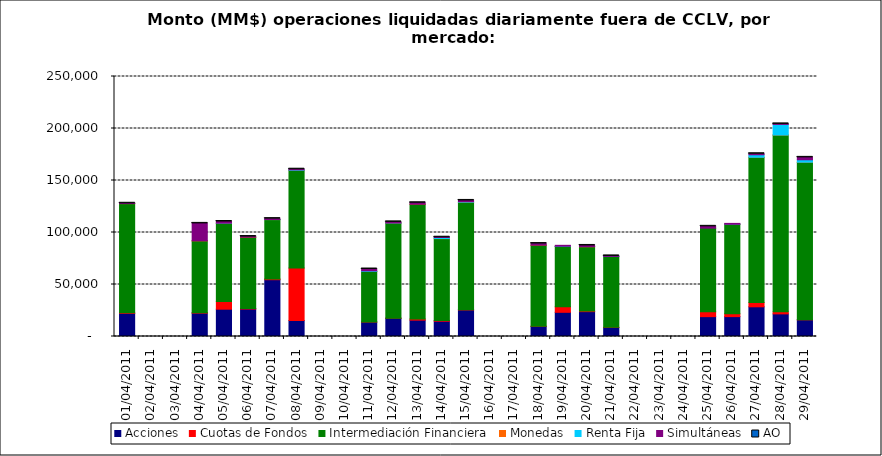
| Category | Acciones | Cuotas de Fondos | Intermediación Financiera | Monedas | Renta Fija | Simultáneas | AO |
|---|---|---|---|---|---|---|---|
| 01/04/2011 | 22264.197 | 586.156 | 104943.532 | 11.323 | 0 | 280.113 | 0.013 |
| 04/04/2011 | 22448.021 | 443.209 | 69111.594 | 4.522 | 0 | 16739.111 | 0.68 |
| 05/04/2011 | 26262.252 | 7355.951 | 75334.115 | 17.674 | 31.935 | 1554.46 | 0.091 |
| 06/04/2011 | 26410.345 | 490.628 | 68619.976 | 0.9 | 0 | 573.157 | 0.369 |
| 07/04/2011 | 54597.099 | 742.13 | 57081.821 | 4.95 | 44.31 | 854.378 | 0.042 |
| 08/04/2011 | 15390.42 | 50570.115 | 93793.987 | 16.65 | 495.311 | 567.007 | 0.17 |
| 11/04/2011 | 13861.851 | 194.394 | 48473.616 | 0.45 | 598.526 | 1733.566 | 0.634 |
| 12/04/2011 | 17545.525 | 54.77 | 91561.272 | 5.167 | 22.203 | 1009.548 | 0.492 |
| 13/04/2011 | 15722.303 | 1177.219 | 110260.082 | 5.84 | 0 | 1409.89 | 0.01 |
| 14/04/2011 | 14688.852 | 789.483 | 78618.838 | 102.15 | 1016.715 | 229.176 | 0.103 |
| 15/04/2011 | 25505.648 | 224.17 | 103432.611 | 12.012 | 506.319 | 1147.445 | 0.118 |
| 18/04/2011 | 9695.876 | 167.431 | 77981.93 | 5.436 | 0 | 1489.901 | 0.041 |
| 19/04/2011 | 23255.628 | 5315.809 | 58014.318 | 9.033 | 214.246 | 855.503 | 0 |
| 20/04/2011 | 23905.889 | 522.252 | 61909.866 | 2.718 | 0 | 1191.568 | 0.087 |
| 21/04/2011 | 8654.172 | 174.666 | 68104.956 | 0 | 68.351 | 471.978 | 0.008 |
| 25/04/2011 | 19090.658 | 4777.368 | 80307.008 | 0 | 0 | 1739.644 | 0.77 |
| 26/04/2011 | 19120.847 | 2721.053 | 86039.882 | 18.19 | 5.661 | 849.167 | 0 |
| 27/04/2011 | 28548.983 | 4044.922 | 139740.569 | 2.35 | 2412.235 | 951.229 | 1.229 |
| 28/04/2011 | 21755.311 | 1944.735 | 170001.555 | 18.905 | 10201.923 | 493.688 | 0.858 |
| 29/04/2011 | 16022.172 | 177.229 | 151380.21 | 7.233 | 2338.3 | 2310.162 | 1.027 |